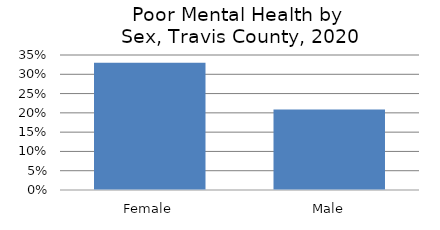
| Category | Series 0 |
|---|---|
| Female | 0.33 |
| Male | 0.209 |